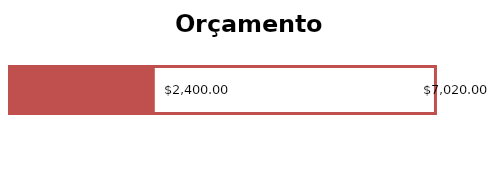
| Category | Renda Total | Despesa Total |
|---|---|---|
| 0 | 7020 | 2400 |